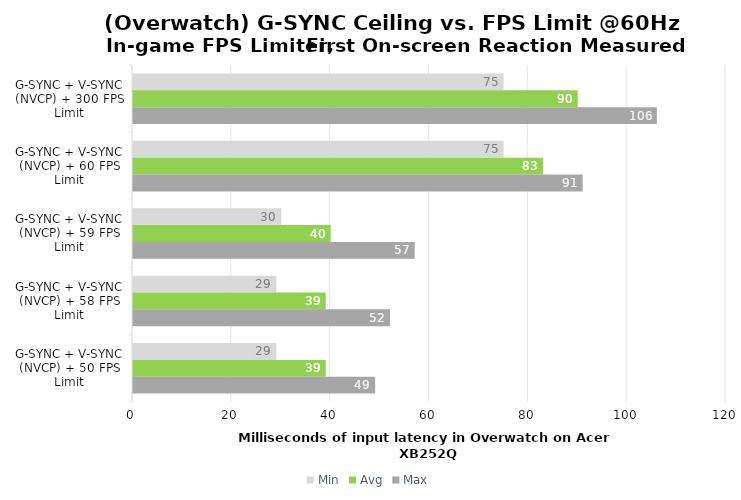
| Category | Min | Avg | Max |
|---|---|---|---|
| G-SYNC + V-SYNC (NVCP) + 300 FPS Limit | 75 | 90 | 106 |
| G-SYNC + V-SYNC (NVCP) + 60 FPS Limit | 75 | 83 | 91 |
| G-SYNC + V-SYNC (NVCP) + 59 FPS Limit | 30 | 40 | 57 |
| G-SYNC + V-SYNC (NVCP) + 58 FPS Limit | 29 | 39 | 52 |
| G-SYNC + V-SYNC (NVCP) + 50 FPS Limit | 29 | 39 | 49 |